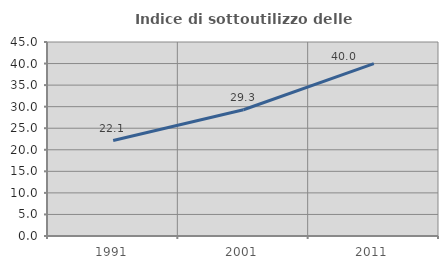
| Category | Indice di sottoutilizzo delle abitazioni  |
|---|---|
| 1991.0 | 22.148 |
| 2001.0 | 29.282 |
| 2011.0 | 39.981 |